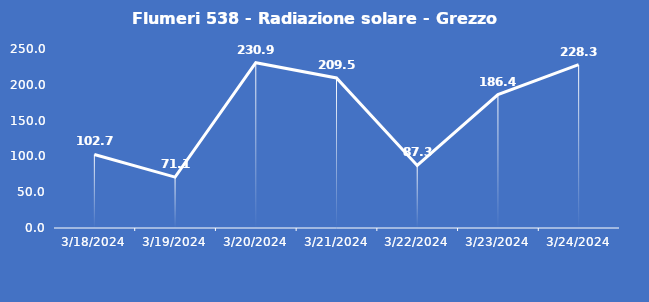
| Category | Flumeri 538 - Radiazione solare - Grezzo (W/m2) |
|---|---|
| 3/18/24 | 102.7 |
| 3/19/24 | 71.1 |
| 3/20/24 | 230.9 |
| 3/21/24 | 209.5 |
| 3/22/24 | 87.3 |
| 3/23/24 | 186.4 |
| 3/24/24 | 228.3 |